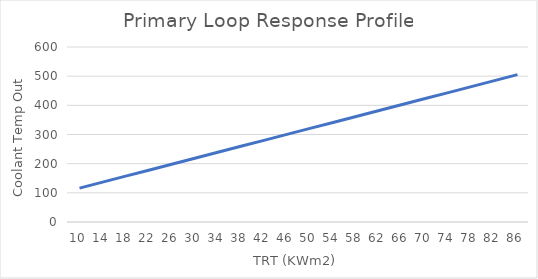
| Category | Series 0 |
|---|---|
| 10.0 | 116.192 |
| 14.0 | 136.662 |
| 18.0 | 157.132 |
| 22.0 | 177.603 |
| 26.0 | 198.073 |
| 30.0 | 218.543 |
| 34.0 | 239.014 |
| 38.0 | 259.484 |
| 42.0 | 279.954 |
| 46.0 | 300.425 |
| 50.0 | 320.895 |
| 54.0 | 341.365 |
| 58.0 | 361.836 |
| 62.0 | 382.306 |
| 66.0 | 402.776 |
| 70.0 | 423.247 |
| 74.0 | 443.717 |
| 78.0 | 464.187 |
| 82.0 | 484.658 |
| 86.0 | 505.128 |